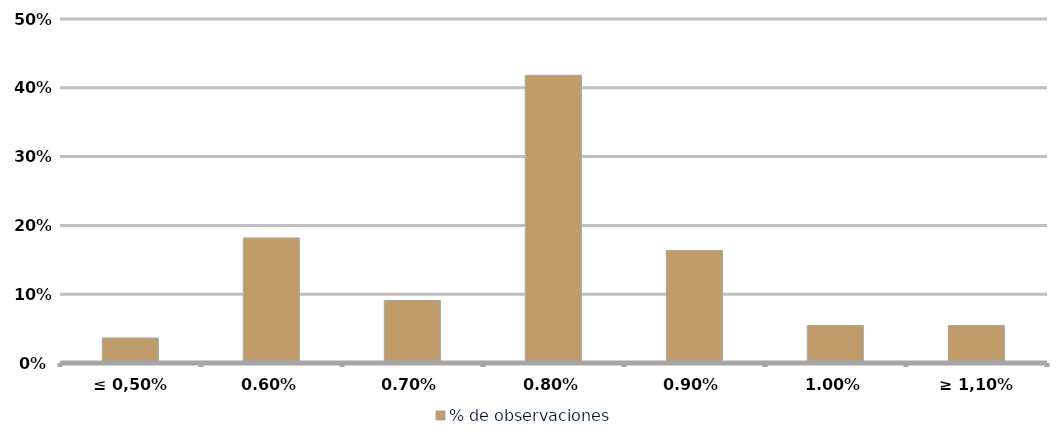
| Category | % de observaciones  |
|---|---|
| ≤ 0,50% | 0.036 |
| 0,60% | 0.182 |
| 0,70% | 0.091 |
| 0,80% | 0.418 |
| 0,90% | 0.164 |
| 1,00% | 0.055 |
| ≥ 1,10% | 0.055 |